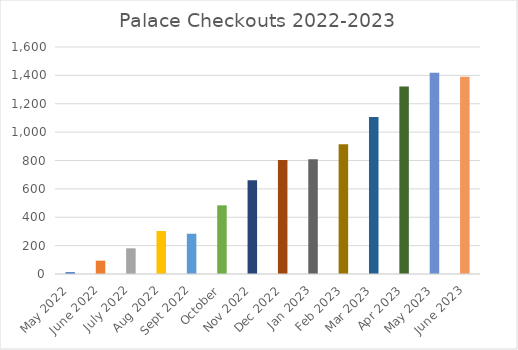
| Category | # |
|---|---|
| May 2022 | 13 |
| June 2022 | 94 |
| July 2022 | 181 |
| Aug 2022 | 303 |
| Sept 2022 | 284 |
| October | 484 |
| Nov 2022 | 661 |
| Dec 2022 | 803 |
| Jan 2023 | 809 |
| Feb 2023 | 914 |
| Mar 2023 | 1107 |
| Apr 2023 | 1321 |
| May 2023 | 1418 |
| June 2023 | 1391 |